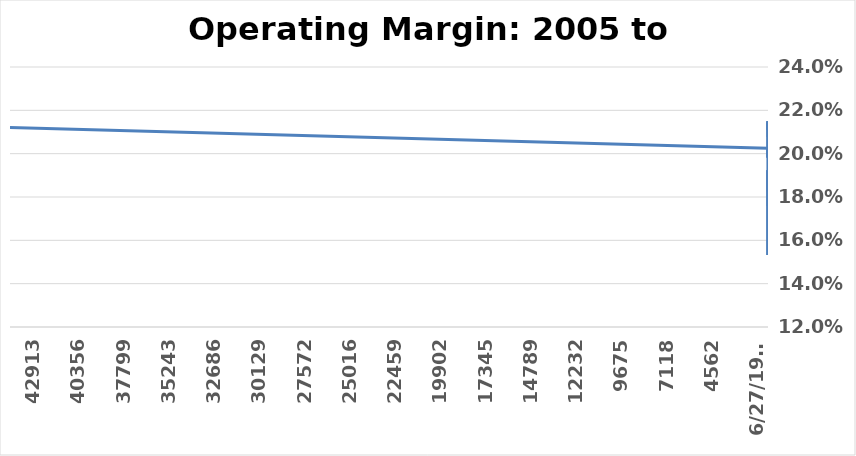
| Category | Operating margin |
|---|---|
| 9/30/22 | 0.212 |
| 7/13/05 | 0.203 |
| 7/12/05 | 0.202 |
| 7/11/05 | 0.198 |
| 7/10/05 | 0.201 |
| 7/9/05 | 0.201 |
| 7/8/05 | 0.201 |
| 7/7/05 | 0.214 |
| 7/6/05 | 0.211 |
| 7/5/05 | 0.214 |
| 7/4/05 | 0.215 |
| 7/3/05 | 0.208 |
| 7/2/05 | 0.189 |
| 7/1/05 | 0.153 |
| 6/30/05 | 0.192 |
| 6/29/05 | 0.183 |
| 6/28/05 | 0.177 |
| 6/27/05 | 0.176 |